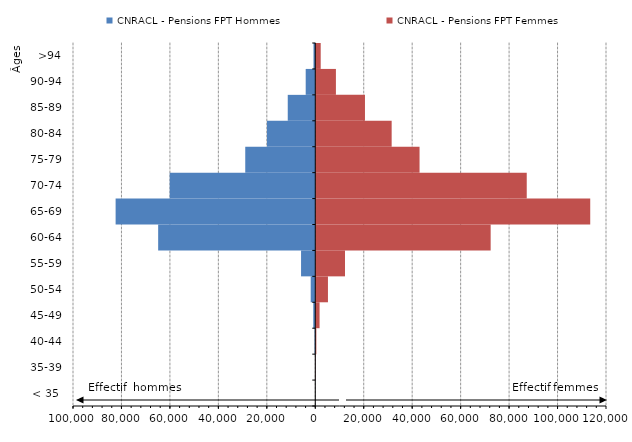
| Category | CNRACL - Pensions FPT Hommes | CNRACL - Pensions FPT Femmes |
|---|---|---|
| < 35  | -24 | 27 |
| 35-39 | -105 | 147 |
| 40-44 | -294 | 449 |
| 45-49 | -829 | 1770 |
| 50-54 | -1888 | 5234 |
| 55-59 | -5871 | 12261 |
| 60-64 | -64850 | 72391 |
| 65-69 | -82409 | 113490 |
| 70-74 | -60082 | 87286 |
| 75-79 | -28902 | 43040 |
| 80-84 | -19939 | 31531 |
| 85-89 | -11360 | 20514 |
| 90-94 | -3951 | 8522 |
| >94 | -735 | 2242 |